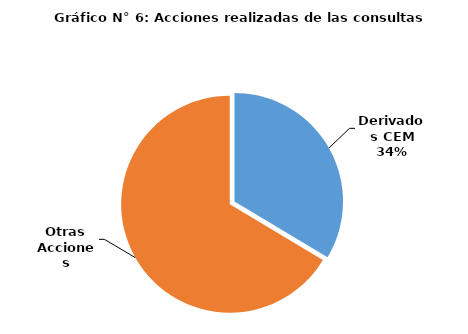
| Category | Series 0 |
|---|---|
| 0 | 63840 |
| 1 | 126178 |